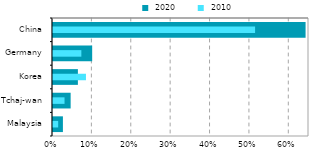
| Category |  2020 |
|---|---|
| Malaysia | 0.025 |
| Tchaj-wan | 0.045 |
| Korea | 0.063 |
| Germany | 0.099 |
| China | 0.641 |